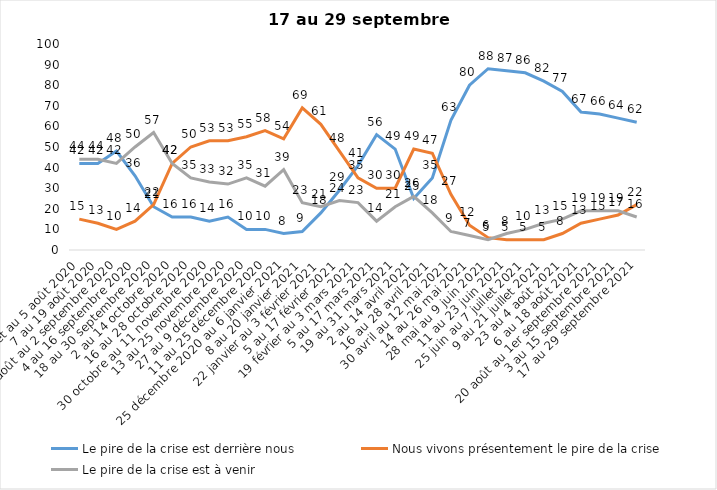
| Category | Le pire de la crise est derrière nous | Nous vivons présentement le pire de la crise | Le pire de la crise est à venir |
|---|---|---|---|
| 24 juillet au 5 août 2020 | 42 | 15 | 44 |
| 7 au 19 août 2020 | 42 | 13 | 44 |
| 21 août au 2 septembre 2020 | 48 | 10 | 42 |
| 4 au 16 septembre 2020 | 36 | 14 | 50 |
| 18 au 30 septembre 2020 | 21 | 22 | 57 |
| 2 au 14 octobre 2020 | 16 | 42 | 42 |
| 16 au 28 octobre 2020 | 16 | 50 | 35 |
| 30 octobre au 11 novembre 2020 | 14 | 53 | 33 |
| 13 au 25 novembre 2020 | 16 | 53 | 32 |
| 27 au 9 décembre 2020 | 10 | 55 | 35 |
| 11 au 25 décembre 2020 | 10 | 58 | 31 |
| 25 décembre 2020 au 6 janvier 2021 | 8 | 54 | 39 |
| 8 au 20 janvier 2021 | 9 | 69 | 23 |
| 22 janvier au 3 février 2021 | 18 | 61 | 21 |
| 5 au 17 février 2021 | 29 | 48 | 24 |
| 19 février au 3 mars 2021 | 41 | 35 | 23 |
| 5 au 17 mars 2021 | 56 | 30 | 14 |
| 19 au 31 mars 2021 | 49 | 30 | 21 |
| 2 au 14 avril 2021 | 25 | 49 | 26 |
| 16 au 28 avril 2021 | 35 | 47 | 18 |
| 30 avril au 12 mai 2021 | 63 | 27 | 9 |
| 14 au 26 mai 2021 | 80 | 12 | 7 |
| 28 mai au 9 juin 2021 | 88 | 6 | 5 |
| 11 au 23 juin 2021 | 87 | 5 | 8 |
| 25 juin au 7 juillet 2021 | 86 | 5 | 10 |
| 9 au 21 juillet 2021 | 82 | 5 | 13 |
| 23 au 4 août 2021 | 77 | 8 | 15 |
| 6 au 18 août 2021 | 67 | 13 | 19 |
| 20 août au 1er septembre 2021 | 66 | 15 | 19 |
| 3 au 15 septembre 2021 | 64 | 17 | 19 |
| 17 au 29 septembre 2021 | 62 | 22 | 16 |